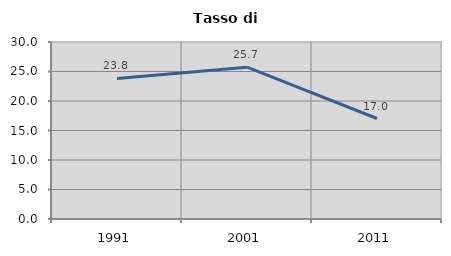
| Category | Tasso di disoccupazione   |
|---|---|
| 1991.0 | 23.815 |
| 2001.0 | 25.729 |
| 2011.0 | 17.032 |